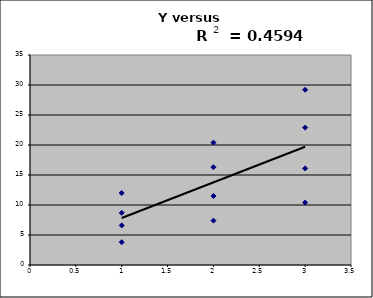
| Category | Y |
|---|---|
| 1.0 | 3.8 |
| 1.0 | 6.6 |
| 1.0 | 8.7 |
| 1.0 | 12 |
| 2.0 | 7.4 |
| 2.0 | 11.5 |
| 2.0 | 16.3 |
| 2.0 | 20.4 |
| 3.0 | 10.4 |
| 3.0 | 16.1 |
| 3.0 | 22.9 |
| 3.0 | 29.2 |